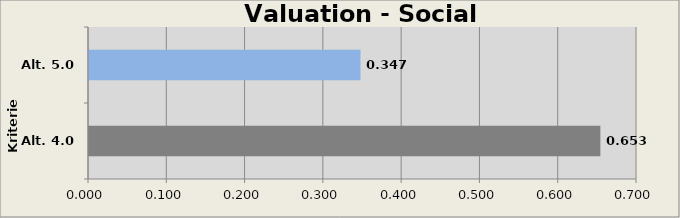
| Category | Valuation Social Module  |
|---|---|
| Alt. 4.0 m | 0.653 |
| Alt. 5.0 m | 0.347 |